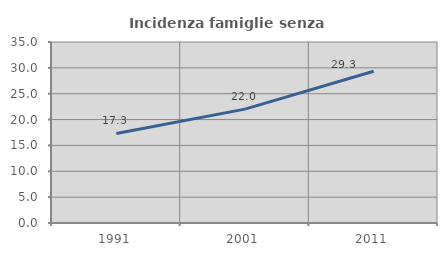
| Category | Incidenza famiglie senza nuclei |
|---|---|
| 1991.0 | 17.325 |
| 2001.0 | 22.019 |
| 2011.0 | 29.35 |